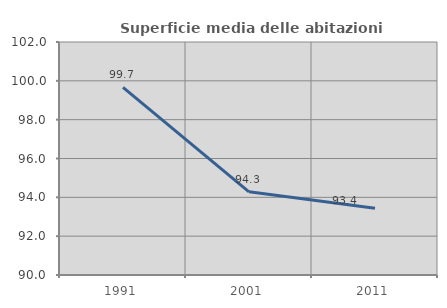
| Category | Superficie media delle abitazioni occupate |
|---|---|
| 1991.0 | 99.66 |
| 2001.0 | 94.286 |
| 2011.0 | 93.435 |